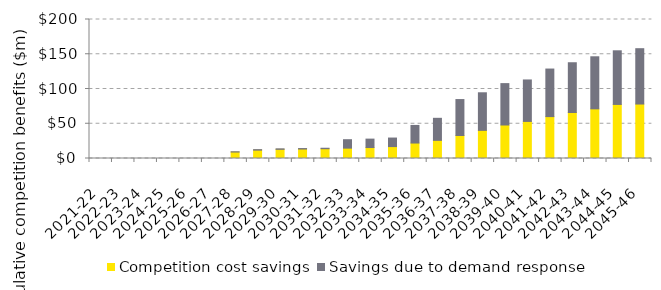
| Category | Competition cost savings | Savings due to demand response |
|---|---|---|
| 2021-22 | 0 | 0 |
| 2022-23 | 0 | 0 |
| 2023-24 | 0 | 0 |
| 2024-25 | 0 | 0 |
| 2025-26 | 0 | 0 |
| 2026-27 | 0 | 0 |
| 2027-28 | 9.299 | 0.38 |
| 2028-29 | 12.027 | 0.72 |
| 2029-30 | 13.159 | 0.737 |
| 2030-31 | 13.605 | 0.691 |
| 2031-32 | 14.062 | 0.698 |
| 2032-33 | 14.896 | 12.166 |
| 2033-34 | 15.765 | 12.126 |
| 2034-35 | 17.137 | 12.293 |
| 2035-36 | 22.248 | 25.316 |
| 2036-37 | 26.106 | 31.715 |
| 2037-38 | 33.111 | 51.703 |
| 2038-39 | 40.483 | 54.077 |
| 2039-40 | 48.206 | 59.545 |
| 2040-41 | 53.342 | 59.674 |
| 2041-42 | 60.288 | 68.422 |
| 2042-43 | 66.156 | 71.629 |
| 2043-44 | 71.438 | 74.914 |
| 2044-45 | 77.793 | 77.17 |
| 2045-46 | 78.363 | 79.635 |